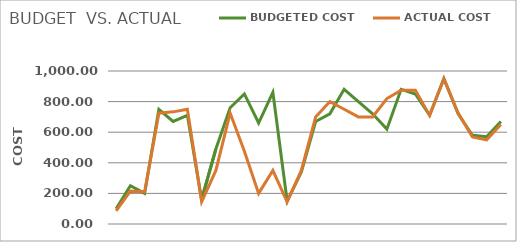
| Category | BUDGETED COST | ACTUAL COST |
|---|---|---|
| 0 | 100 | 85 |
| 1 | 250 | 215 |
| 2 | 200 | 210 |
| 3 | 750 | 724 |
| 4 | 670 | 733 |
| 5 | 710 | 750 |
| 6 | 160 | 145 |
| 7 | 490 | 350 |
| 8 | 760 | 725 |
| 9 | 850 | 475 |
| 10 | 660 | 200 |
| 11 | 860 | 350 |
| 12 | 150 | 144 |
| 13 | 340 | 350 |
| 14 | 670 | 700 |
| 15 | 720 | 800 |
| 16 | 880 | 750 |
| 17 | 800 | 700 |
| 18 | 720 | 700 |
| 19 | 620 | 820 |
| 20 | 880 | 875 |
| 21 | 850 | 875 |
| 22 | 710 | 710 |
| 23 | 950 | 949 |
| 24 | 720 | 725 |
| 25 | 580 | 569 |
| 26 | 570 | 550 |
| 27 | 670 | 650 |